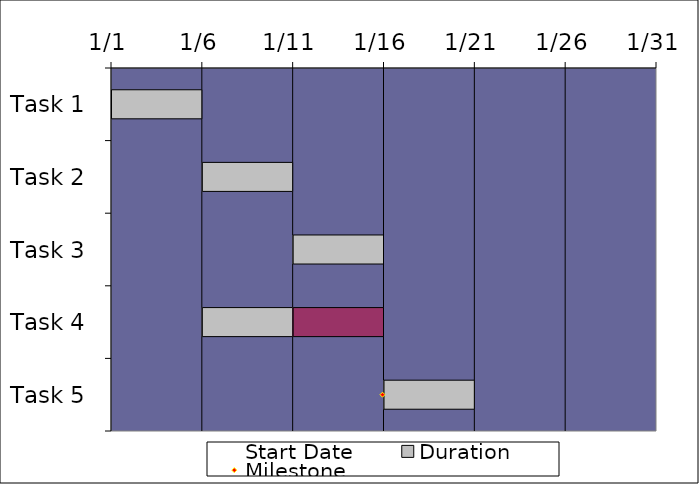
| Category | Start Date | Duration | Slack |
|---|---|---|---|
| Task 1 | 1 | 5 | 0 |
| Task 2 | 6 | 5 | 0 |
| Task 3 | 11 | 5 | 0 |
| Task 4 | 6 | 5 | 5 |
| Task 5 | 16 | 5 | 0 |